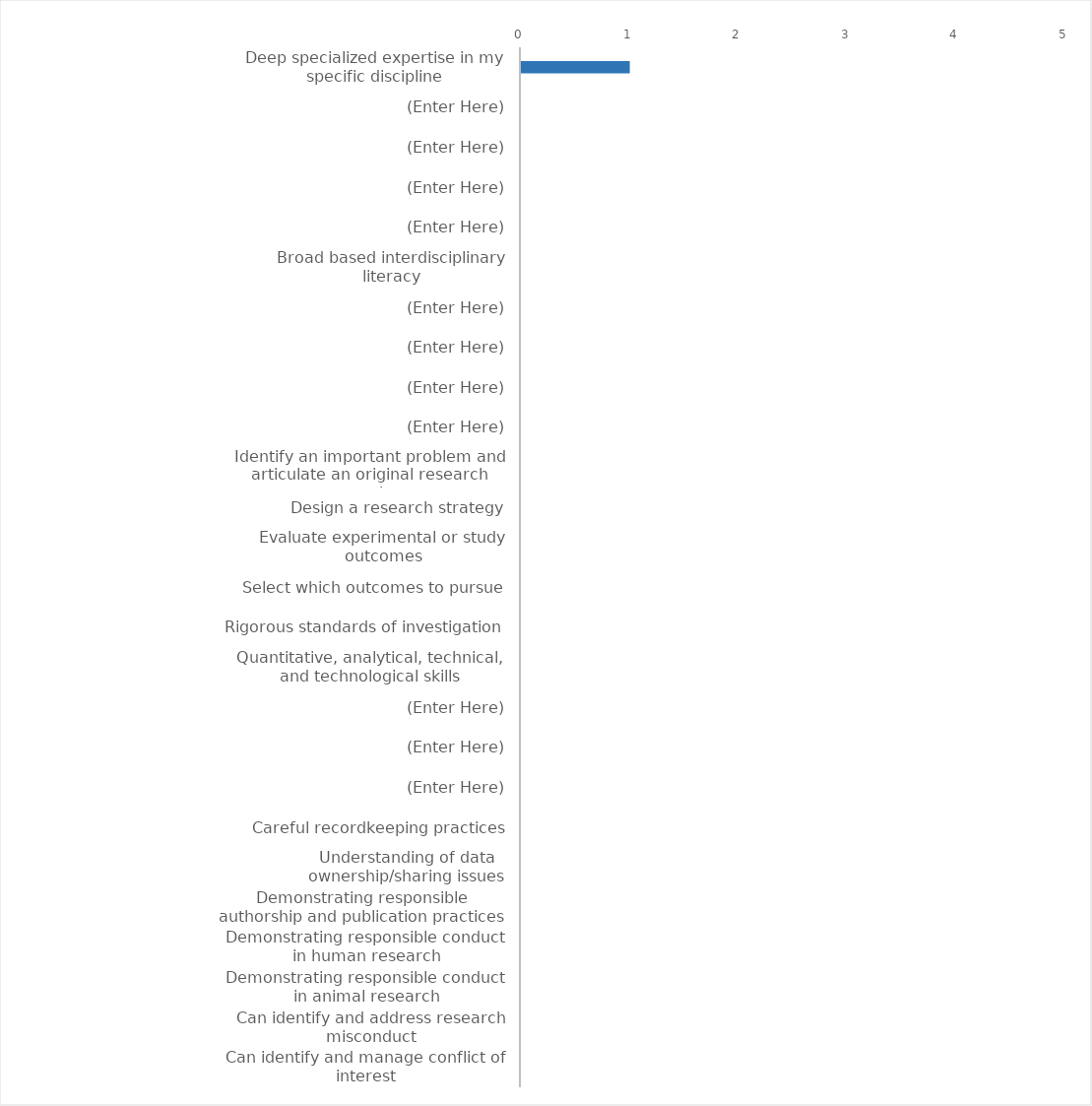
| Category | Series 0 |
|---|---|
| Deep specialized expertise in my specific discipline | 1 |
| (Enter Here) | 0 |
| (Enter Here) | 0 |
| (Enter Here) | 0 |
| (Enter Here) | 0 |
| Broad based interdisciplinary literacy | 0 |
| (Enter Here) | 0 |
| (Enter Here) | 0 |
| (Enter Here) | 0 |
| (Enter Here) | 0 |
| Identify an important problem and articulate an original research question | 0 |
| Design a research strategy | 0 |
| Evaluate experimental or study outcomes | 0 |
| Select which outcomes to pursue | 0 |
| Rigorous standards of investigation | 0 |
| Quantitative, analytical, technical, and technological skills | 0 |
| (Enter Here) | 0 |
| (Enter Here) | 0 |
| (Enter Here) | 0 |
| Careful recordkeeping practices | 0 |
| Understanding of data ownership/sharing issues | 0 |
| Demonstrating responsible authorship and publication practices | 0 |
| Demonstrating responsible conduct in human research | 0 |
| Demonstrating responsible conduct in animal research | 0 |
| Can identify and address research misconduct | 0 |
| Can identify and manage conflict of interest | 0 |